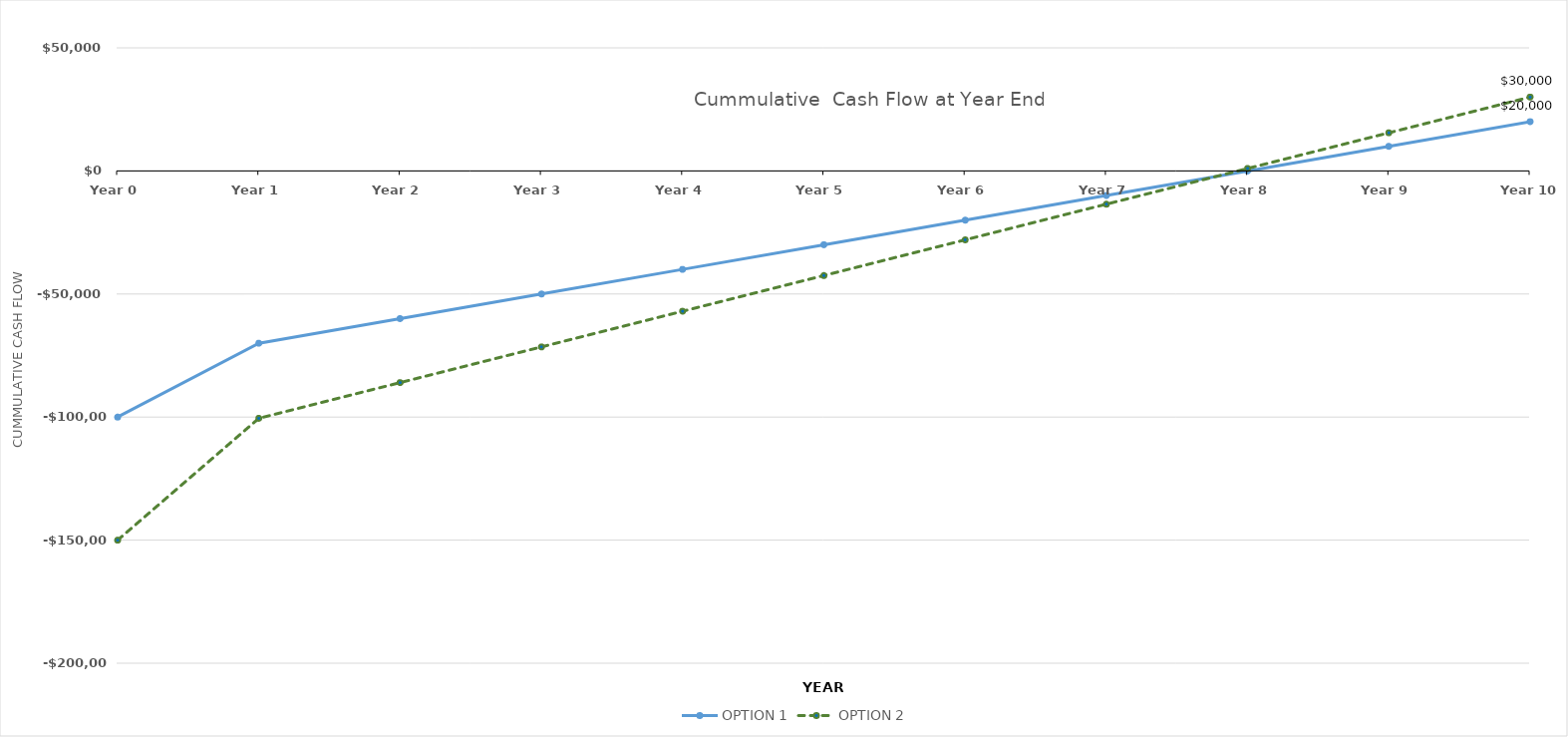
| Category | OPTION 1 | OPTION 2 |
|---|---|---|
| Year 0 | -100000 | -150000 |
| Year 1 | -70000 | -100500 |
| Year 2 | -60000 | -86000 |
| Year 3 | -50000 | -71500 |
| Year 4 | -40000 | -57000 |
| Year 5 | -30000 | -42500 |
| Year 6 | -20000 | -28000 |
| Year 7 | -10000 | -13500 |
| Year 8 | 0 | 1000 |
| Year 9 | 10000 | 15500 |
| Year 10 | 20000 | 30000 |